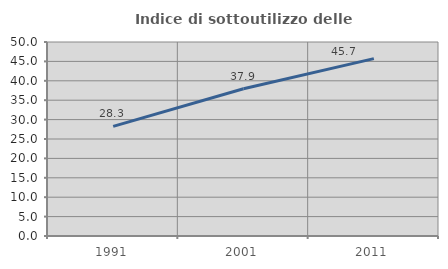
| Category | Indice di sottoutilizzo delle abitazioni  |
|---|---|
| 1991.0 | 28.269 |
| 2001.0 | 37.943 |
| 2011.0 | 45.719 |